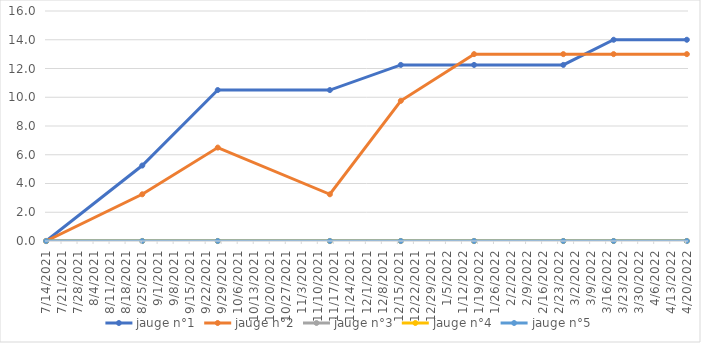
| Category | jauge n°1 | jauge n°2 | jauge n°3 | jauge n°4 | jauge n°5 |
|---|---|---|---|---|---|
| 7/14/21 | 0 | 0 | 0 | 0 | 0 |
| 8/25/21 | 5.25 | 3.25 | 0 | 0 | 0 |
| 9/27/21 | 10.5 | 6.5 | 0 | 0 | 0 |
| 11/15/21 | 10.5 | 3.25 | 0 | 0 | 0 |
| 12/16/21 | 12.25 | 9.75 | 0 | 0 | 0 |
| 1/17/22 | 12.25 | 13 | 0 | 0 | 0 |
| 2/25/22 | 12.25 | 13 | 0 | 0 | 0 |
| 3/19/22 | 14 | 13 | 0 | 0 | 0 |
| 4/20/22 | 14 | 13 | 0 | 0 | 0 |